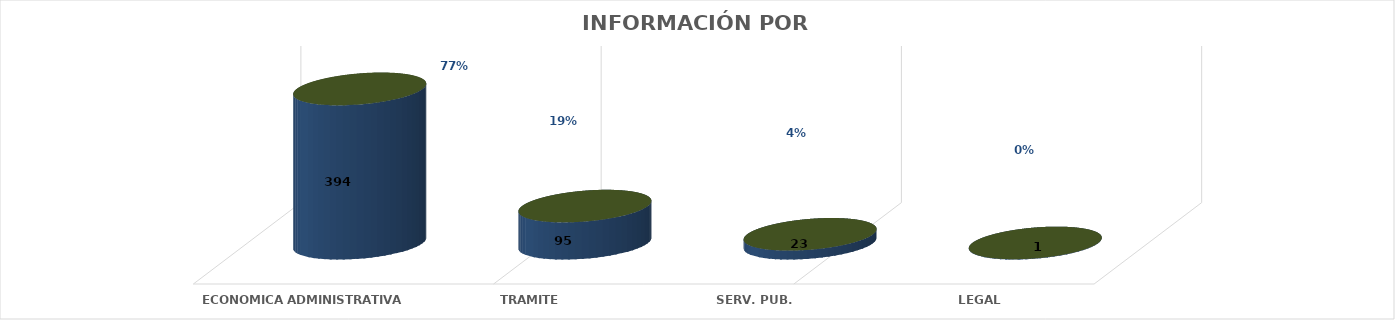
| Category | Series 0 | Series 1 | Series 2 | Series 3 | Series 4 |
|---|---|---|---|---|---|
| ECONOMICA ADMINISTRATIVA |  |  |  | 394 | 0.768 |
| TRAMITE |  |  |  | 95 | 0.185 |
| SERV. PUB. |  |  |  | 23 | 0.045 |
| LEGAL |  |  |  | 1 | 0.002 |